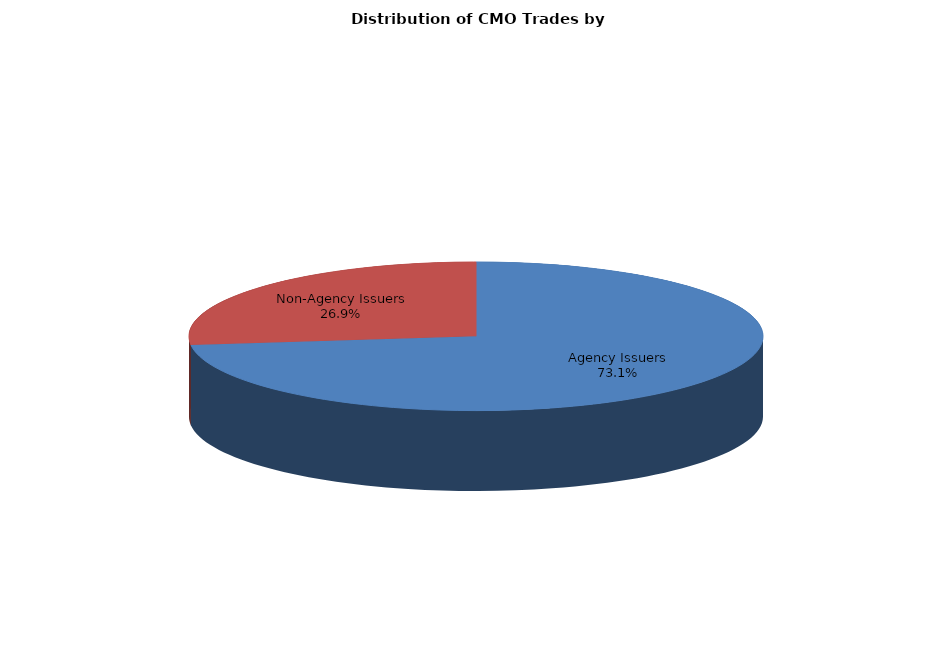
| Category | Series 0 |
|---|---|
| Agency Issuers | 1247.333 |
| Non-Agency Issuers | 458.159 |